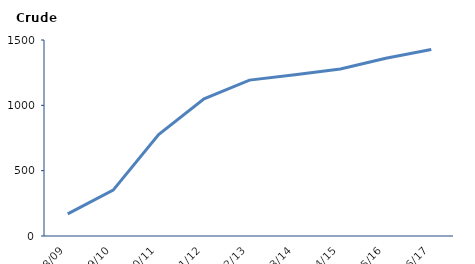
| Category | Crude rate |
|---|---|
| 2008/09 | 169 |
| 2009/10 | 351 |
| 2010/11 | 776 |
| 2011/12 | 1049 |
| 2012/13 | 1193 |
| 2013/14 | 1234.9 |
| 2014/15 | 1277.5 |
| 2015/16 | 1360.3 |
| 2016/17 | 1426.6 |